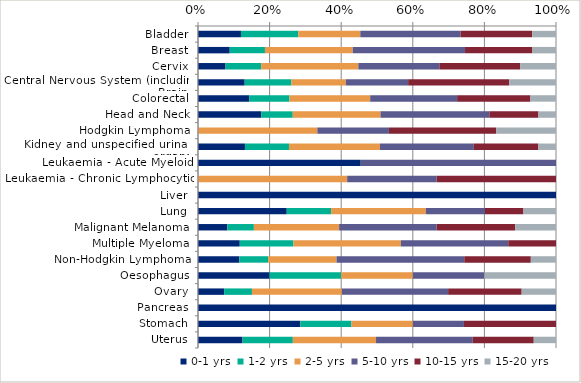
| Category | 0-1 yrs | 1-2 yrs | 2-5 yrs | 5-10 yrs | 10-15 yrs | 15-20 yrs |
|---|---|---|---|---|---|---|
| Bladder | 0.12 | 0.16 | 0.173 | 0.28 | 0.2 | 0.067 |
| Breast | 0.089 | 0.098 | 0.245 | 0.314 | 0.188 | 0.066 |
| Cervix | 0.077 | 0.1 | 0.271 | 0.226 | 0.226 | 0.1 |
| Central Nervous System (including Brain) | 0.13 | 0.13 | 0.152 | 0.174 | 0.283 | 0.13 |
| Colorectal | 0.143 | 0.113 | 0.225 | 0.243 | 0.205 | 0.071 |
| Head and Neck | 0.176 | 0.088 | 0.245 | 0.304 | 0.137 | 0.049 |
| Hodgkin Lymphoma | 0 | 0 | 0.333 | 0.2 | 0.3 | 0.167 |
| Kidney and unspecified urinary organs | 0.131 | 0.123 | 0.254 | 0.262 | 0.18 | 0.049 |
| Leukaemia - Acute Myeloid | 0.455 | 0 | 0 | 0.545 | 0 | 0 |
| Leukaemia - Chronic Lymphocytic | 0 | 0 | 0.417 | 0.25 | 0.333 | 0 |
| Liver | 1 | 0 | 0 | 0 | 0 | 0 |
| Lung | 0.248 | 0.124 | 0.264 | 0.165 | 0.107 | 0.091 |
| Malignant Melanoma | 0.082 | 0.074 | 0.238 | 0.272 | 0.22 | 0.114 |
| Multiple Myeloma | 0.117 | 0.15 | 0.3 | 0.3 | 0.133 | 0 |
| Non-Hodgkin Lymphoma | 0.116 | 0.08 | 0.191 | 0.357 | 0.186 | 0.07 |
| Oesophagus | 0.2 | 0.2 | 0.2 | 0.2 | 0 | 0.2 |
| Ovary | 0.073 | 0.078 | 0.251 | 0.297 | 0.205 | 0.096 |
| Pancreas | 1 | 0 | 0 | 0 | 0 | 0 |
| Stomach | 0.286 | 0.143 | 0.171 | 0.143 | 0.257 | 0 |
| Uterus | 0.124 | 0.141 | 0.232 | 0.27 | 0.17 | 0.062 |